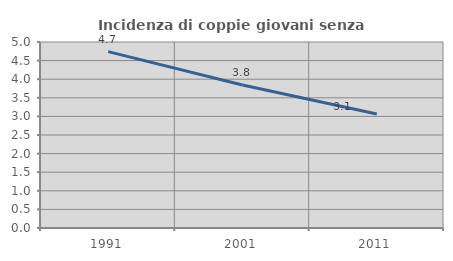
| Category | Incidenza di coppie giovani senza figli |
|---|---|
| 1991.0 | 4.742 |
| 2001.0 | 3.846 |
| 2011.0 | 3.067 |